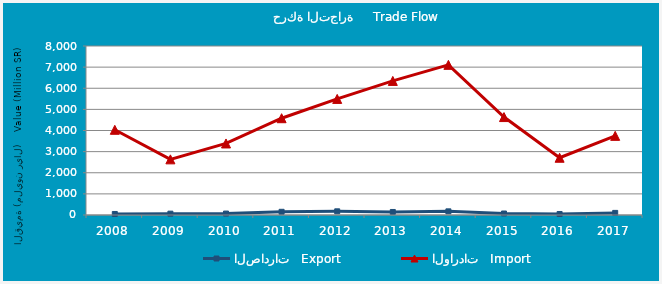
| Category | الصادرات   Export | الواردات   Import |
|---|---|---|
| 2008.0 | 48217803 | 4033227439 |
| 2009.0 | 63256872 | 2633970335 |
| 2010.0 | 67320482 | 3386403517 |
| 2011.0 | 151147679 | 4581793282 |
| 2012.0 | 174336076 | 5495310488 |
| 2013.0 | 143418454 | 6347571250 |
| 2014.0 | 172575217 | 7107331977 |
| 2015.0 | 70341711 | 4635545684 |
| 2016.0 | 47389018 | 2709341058 |
| 2017.0 | 99751600 | 3745597219 |